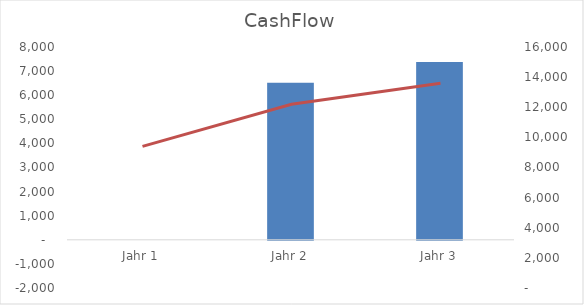
| Category | Series 0 |
|---|---|
| Jahr 1 | -663.569 |
| Jahr 2 | 6518.975 |
| Jahr 3 | 7381.048 |